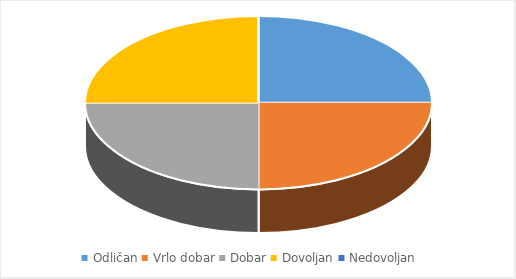
| Category | Series 0 |
|---|---|
| Odličan | 1 |
| Vrlo dobar | 1 |
| Dobar | 1 |
| Dovoljan | 1 |
| Nedovoljan | 0 |